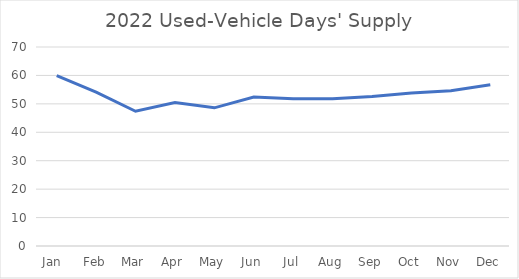
| Category | Series 0 |
|---|---|
| Jan  | 59.9 |
| Feb | 54.1 |
| Mar | 47.4 |
| Apr | 50.5 |
| May | 48.6 |
| Jun | 52.4 |
| Jul | 51.8 |
| Aug | 51.8 |
| Sep | 52.6 |
| Oct | 53.8 |
| Nov | 54.6 |
| Dec | 56.7 |